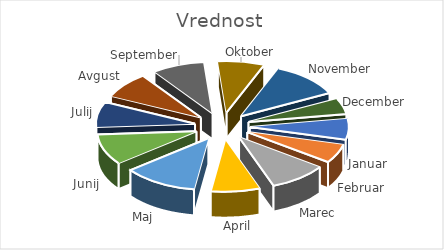
| Category | Vrednost |
|---|---|
| Januar | 18167 |
| Februar | 16571 |
| Marec | 26701 |
| April | 22452 |
| Maj | 33977 |
| Junij | 27001 |
| Julij | 22197 |
| Avgust | 22893 |
| September | 24208 |
| Oktober | 21400 |
| November | 31965 |
| December | 13805 |